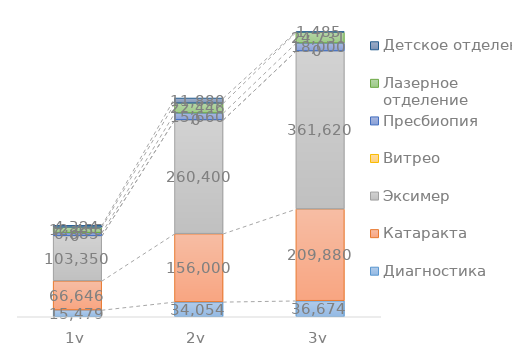
| Category | Диагностика | Катаракта | Эксимер | Витрео | Пресбиопия | Лазерное отделение | Детское отделение |
|---|---|---|---|---|---|---|---|
| 1y | 15479.1 | 66646 | 103350 | 0 | 6885 | 12454.58 | 4324 |
| 2y | 34054.02 | 156000 | 260400 | 0 | 15660 | 22446.388 | 11880 |
| 3y | 36673.56 | 209880 | 361620 | 0 | 18000 | 24731.328 | 1485 |